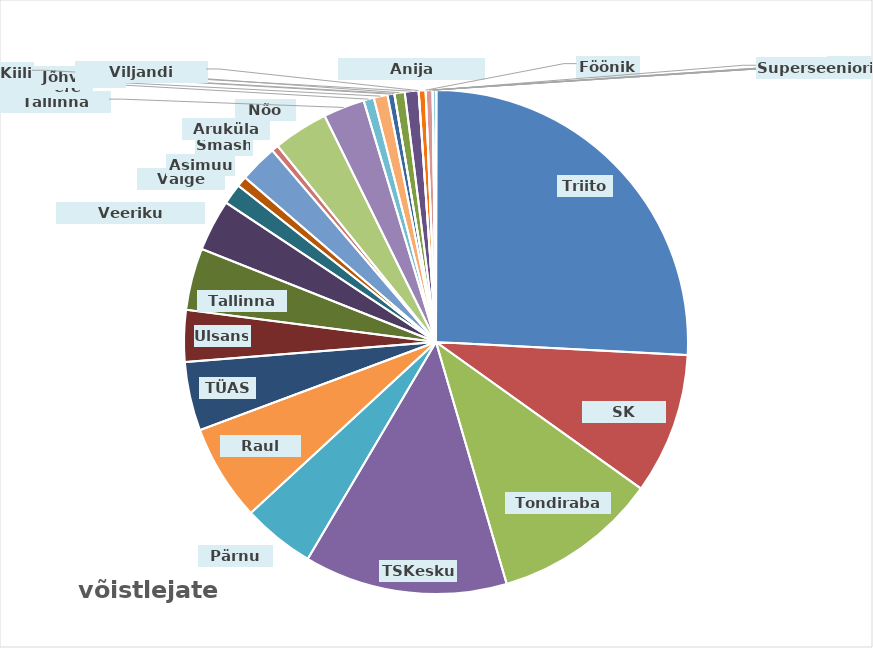
| Category | kokku |
|---|---|
| Triiton | 117 |
| SK Fookus | 41 |
| Tondiraba SK | 48 |
| TSKeskus | 59 |
| Pärnu SK | 21 |
| Raul Must | 28 |
| TÜASK | 20 |
| Ulsans | 15 |
| Tallinna SK | 18 |
| Veeriku Badminton | 15 |
| Valge Hani | 6 |
| Asimuut | 3 |
| Smash | 11 |
| Aruküla SK | 2 |
| Nõo SK | 16 |
| Tallinna Kalev | 12 |
| Rakvere SK | 3 |
| Kuuse | 4 |
| TalTech | 2 |
| Harko | 0 |
| Jõhvi Spordikool | 3 |
| Kiili | 4 |
| Viljandi Sulelised | 0 |
| Anija Sulgpalliklubi | 2 |
| Fööniks | 0 |
| USTA | 2 |
| Viimsi | 0 |
| Sarv | 0 |
| Võru | 1 |
| Puhja | 0 |
| Superseeniorid | 0 |